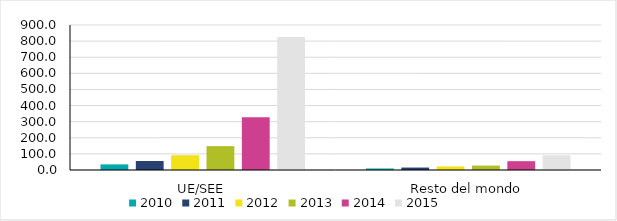
| Category | 2010 | 2011 | 2012 | 2013 | 2014 | 2015 |
|---|---|---|---|---|---|---|
| UE/SEE | 34.839 | 55.762 | 91.878 | 148.087 | 326.775 | 826.153 |
| Resto del mondo | 9.567 | 15.2 | 22.111 | 27.331 | 54.737 | 91.299 |